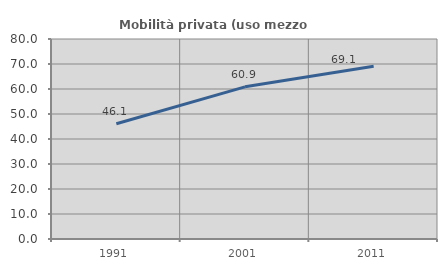
| Category | Mobilità privata (uso mezzo privato) |
|---|---|
| 1991.0 | 46.086 |
| 2001.0 | 60.872 |
| 2011.0 | 69.098 |